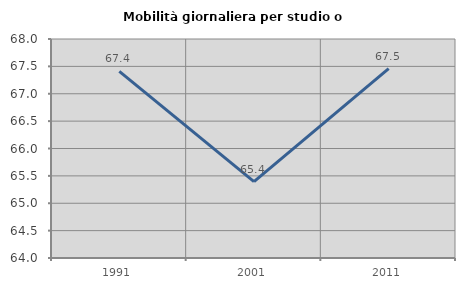
| Category | Mobilità giornaliera per studio o lavoro |
|---|---|
| 1991.0 | 67.409 |
| 2001.0 | 65.395 |
| 2011.0 | 67.459 |